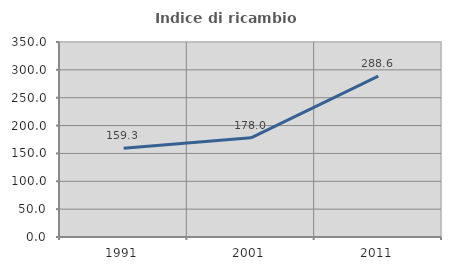
| Category | Indice di ricambio occupazionale  |
|---|---|
| 1991.0 | 159.302 |
| 2001.0 | 178.049 |
| 2011.0 | 288.571 |